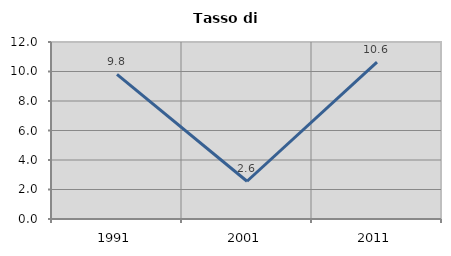
| Category | Tasso di disoccupazione   |
|---|---|
| 1991.0 | 9.804 |
| 2001.0 | 2.559 |
| 2011.0 | 10.635 |